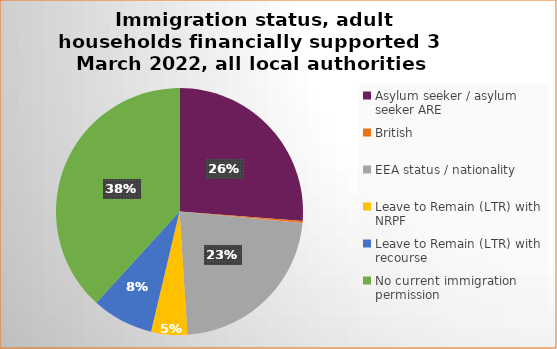
| Category | Number  | Percentage |
|---|---|---|
| Asylum seeker / asylum seeker ARE | 205 | 0.262 |
| British | 2 | 0.003 |
| EEA status / nationality  | 176 | 0.225 |
| Leave to Remain (LTR) with NRPF | 37 | 0.047 |
| Leave to Remain (LTR) with recourse | 63 | 0.081 |
| No current immigration permission | 299 | 0.382 |